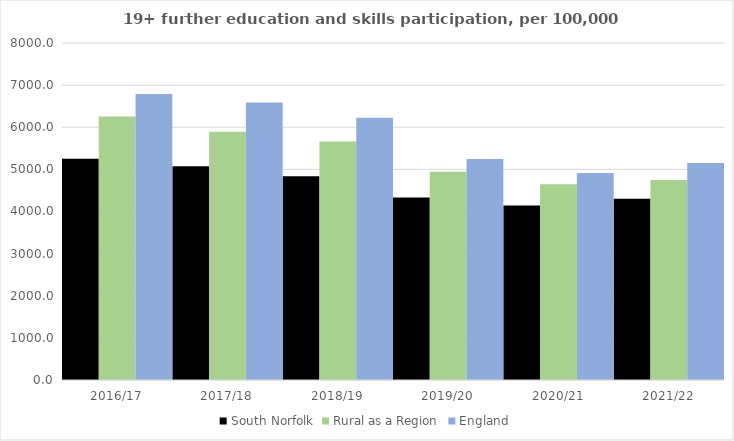
| Category | South Norfolk | Rural as a Region | England |
|---|---|---|---|
| 2016/17 | 5255 | 6253.401 | 6788 |
| 2017/18 | 5072 | 5892.029 | 6588 |
| 2018/19 | 4837 | 5661.873 | 6227 |
| 2019/20 | 4334 | 4943.801 | 5244 |
| 2020/21 | 4140 | 4646.727 | 4913 |
| 2021/22 | 4300 | 4747.049 | 5151 |